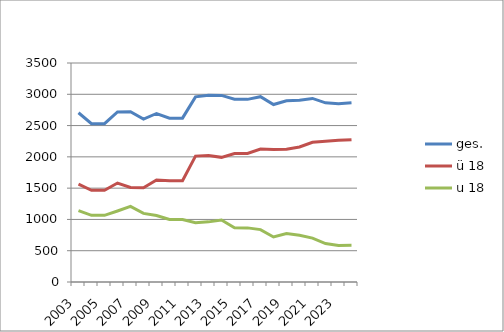
| Category | ges. | ü 18 | u 18 |
|---|---|---|---|
| 2003.0 | 2705 | 1564 | 1141 |
| 2004.0 | 2531 | 1465 | 1066 |
| 2005.0 | 2531 | 1465 | 1066 |
| 2006.0 | 2717 | 1582 | 1135 |
| 2007.0 | 2720 | 1511 | 1209 |
| 2008.0 | 2603 | 1506 | 1097 |
| 2009.0 | 2693 | 1631 | 1062 |
| 2010.0 | 2619 | 1620 | 999 |
| 2011.0 | 2619 | 1620 | 999 |
| 2012.0 | 2959 | 2012 | 947 |
| 2013.0 | 2983 | 2022 | 961 |
| 2014.0 | 2982 | 1992 | 990 |
| 2015.0 | 2922 | 2054 | 868 |
| 2016.0 | 2919 | 2054 | 865 |
| 2017.0 | 2962 | 2125 | 837 |
| 2018.0 | 2836 | 2117 | 719 |
| 2019.0 | 2896 | 2122 | 774 |
| 2020.0 | 2905 | 2158 | 747 |
| 2021.0 | 2934 | 2232 | 702 |
| 2022.0 | 2863 | 2248 | 615 |
| 2023.0 | 2848 | 2264 | 584 |
| 2024.0 | 2863 | 2275 | 588 |